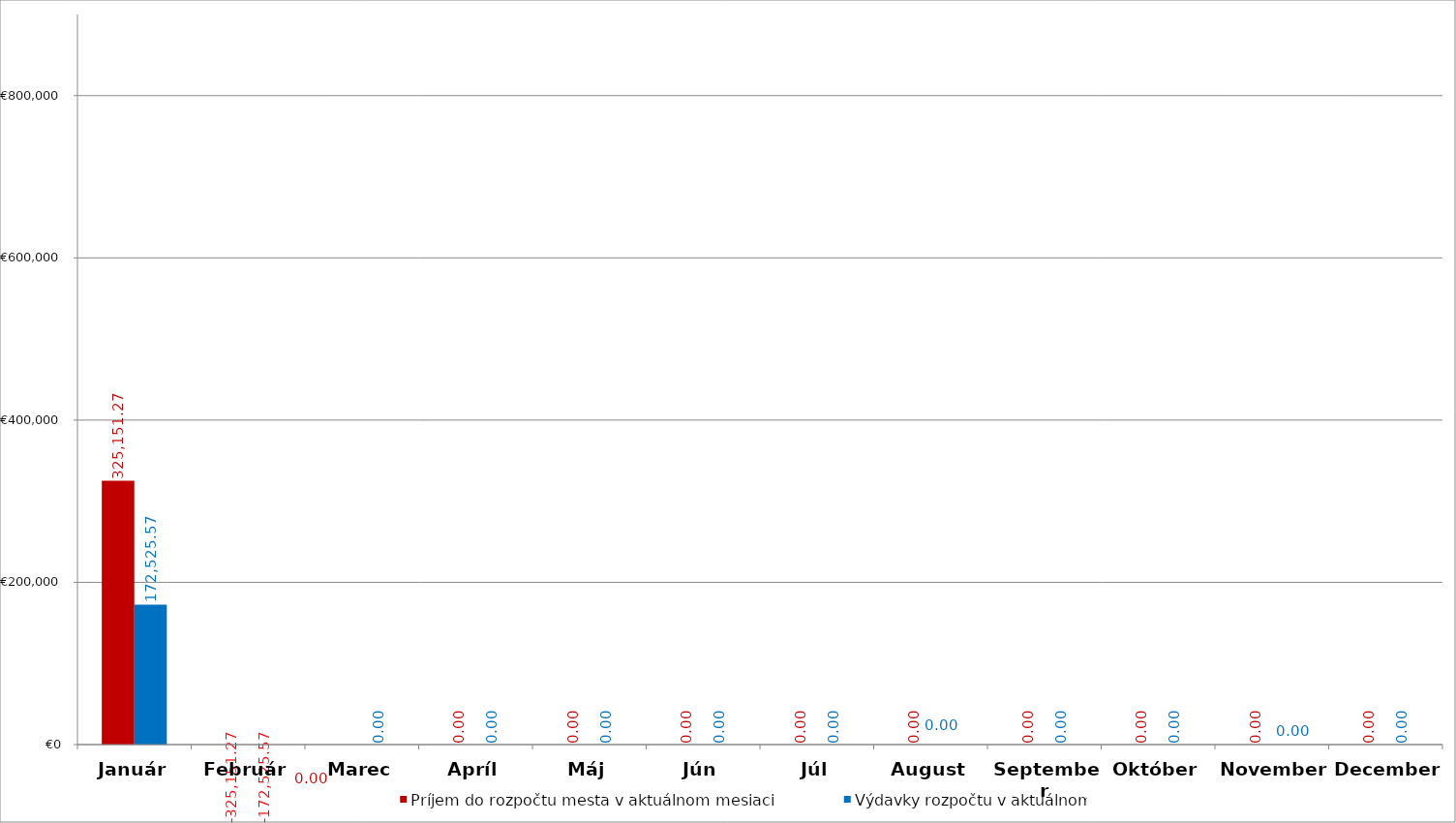
| Category | Príjem do rozpočtu mesta v aktuálnom mesiaci | Výdavky rozpočtu v aktuálnom  mesiaci |
|---|---|---|
| Január | 325151.27 | 172525.57 |
| Február | -325151.27 | -172525.57 |
| Marec | 0 | 0 |
| Apríl | 0 | 0 |
| Máj | 0 | 0 |
| Jún | 0 | 0 |
| Júl | 0 | 0 |
| August | 0 | 0 |
| September | 0 | 0 |
| Október | 0 | 0 |
| November | 0 | 0 |
| December | 0 | 0 |